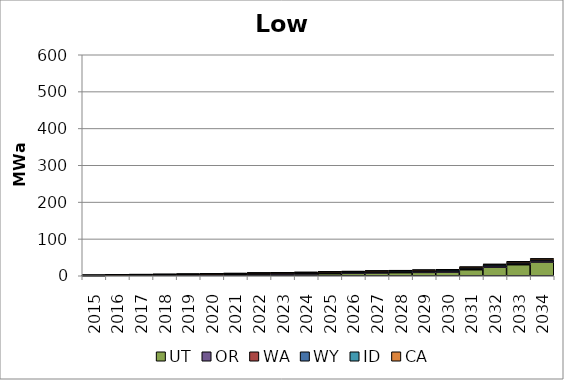
| Category | UT | OR | WA | WY | ID | CA |
|---|---|---|---|---|---|---|
| 2015.0 | 0.491 | 0.377 | 0.003 | 0.01 | 0.02 | 0.579 |
| 2016.0 | 1.297 | 0.858 | 0.008 | 0.028 | 0.051 | 0.61 |
| 2017.0 | 1.352 | 1.449 | 0.008 | 0.029 | 0.055 | 0.63 |
| 2018.0 | 1.392 | 1.76 | 0.008 | 0.032 | 0.059 | 0.64 |
| 2019.0 | 1.494 | 2.162 | 0.01 | 0.051 | 0.086 | 0.7 |
| 2020.0 | 1.801 | 2.665 | 0.019 | 0.078 | 0.143 | 0.737 |
| 2021.0 | 2.358 | 3.164 | 0.03 | 0.109 | 0.22 | 0.795 |
| 2022.0 | 3.211 | 3.245 | 0.051 | 0.142 | 0.304 | 0.84 |
| 2023.0 | 3.857 | 3.337 | 0.069 | 0.171 | 0.379 | 0.89 |
| 2024.0 | 4.664 | 3.45 | 0.09 | 0.201 | 0.463 | 0.946 |
| 2025.0 | 5.599 | 3.572 | 0.119 | 0.235 | 0.575 | 1.028 |
| 2026.0 | 6.552 | 3.697 | 0.154 | 0.289 | 0.667 | 1.059 |
| 2027.0 | 7.485 | 3.853 | 0.187 | 0.353 | 0.761 | 1.093 |
| 2028.0 | 8.315 | 3.995 | 0.215 | 0.404 | 0.845 | 1.129 |
| 2029.0 | 9.07 | 4.114 | 0.242 | 0.707 | 0.929 | 1.27 |
| 2030.0 | 9.852 | 4.241 | 0.268 | 0.792 | 1.061 | 1.407 |
| 2031.0 | 16.337 | 4.362 | 0.294 | 0.875 | 1.153 | 1.622 |
| 2032.0 | 23.17 | 4.483 | 0.324 | 0.971 | 1.271 | 1.842 |
| 2033.0 | 29.984 | 4.588 | 0.357 | 1.066 | 1.385 | 1.957 |
| 2034.0 | 37.094 | 4.722 | 0.389 | 1.158 | 1.543 | 2.18 |